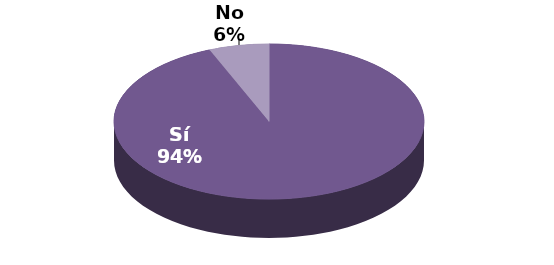
| Category | Series 1 |
|---|---|
| Sí | 15 |
| No | 1 |